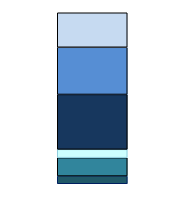
| Category | Series 0 | Series 1 | Series 2 | Series 3 | Series 4 | Series 5 |
|---|---|---|---|---|---|---|
| 0 | 150 | 357 | 162 | 1067 | 917 | 671 |